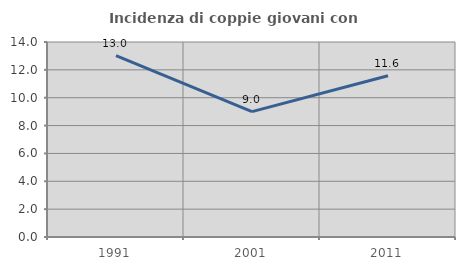
| Category | Incidenza di coppie giovani con figli |
|---|---|
| 1991.0 | 13.023 |
| 2001.0 | 9 |
| 2011.0 | 11.579 |